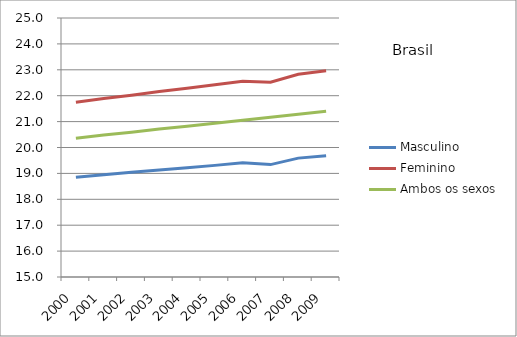
| Category | Masculino | Feminino | Ambos os sexos |
|---|---|---|---|
| 2000.0 | 18.85 | 21.75 | 20.36 |
| 2001.0 | 18.95 | 21.89 | 20.48 |
| 2002.0 | 19.04 | 22.02 | 20.59 |
| 2003.0 | 19.13 | 22.16 | 20.71 |
| 2004.0 | 19.22 | 22.29 | 20.82 |
| 2005.0 | 19.31 | 22.42 | 20.94 |
| 2006.0 | 19.41 | 22.56 | 21.05 |
| 2007.0 | 19.34 | 22.52 | 21.17 |
| 2008.0 | 19.59 | 22.83 | 21.28 |
| 2009.0 | 19.68 | 22.96 | 21.4 |